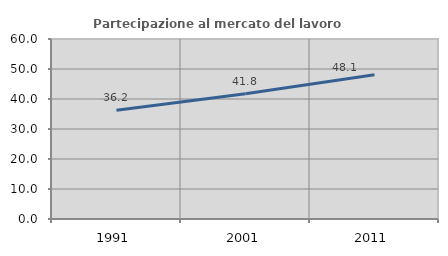
| Category | Partecipazione al mercato del lavoro  femminile |
|---|---|
| 1991.0 | 36.241 |
| 2001.0 | 41.752 |
| 2011.0 | 48.062 |